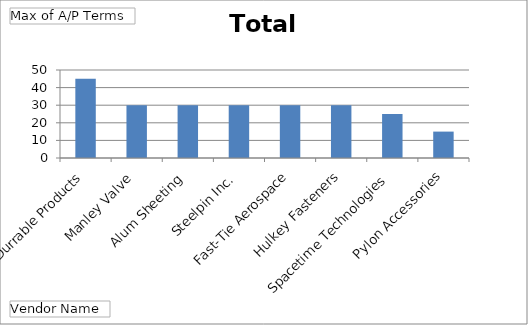
| Category | Total |
|---|---|
| Durrable Products | 45 |
| Manley Valve | 30 |
| Alum Sheeting | 30 |
| Steelpin Inc. | 30 |
| Fast-Tie Aerospace | 30 |
| Hulkey Fasteners | 30 |
| Spacetime Technologies | 25 |
| Pylon Accessories | 15 |